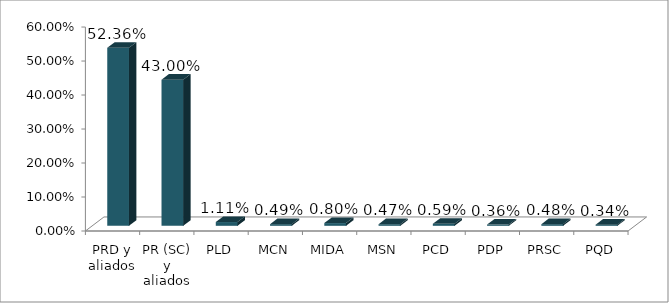
| Category | Votos % |
|---|---|
| PRD y aliados | 0.524 |
| PR (SC) y aliados | 0.43 |
| PLD | 0.011 |
| MCN | 0.005 |
| MIDA | 0.008 |
| MSN | 0.005 |
| PCD | 0.006 |
| PDP | 0.004 |
| PRSC | 0.005 |
| PQD | 0.003 |